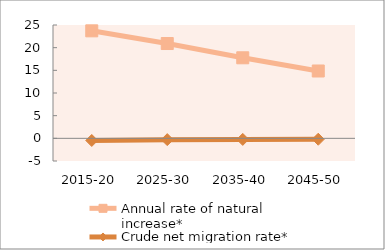
| Category | Annual rate of natural increase* | Crude net migration rate* |
|---|---|---|
| 2015-20 | 23.712 | -0.476 |
| 2025-30 | 20.913 | -0.286 |
| 2035-40 | 17.766 | -0.237 |
| 2045-50 | 14.853 | -0.202 |